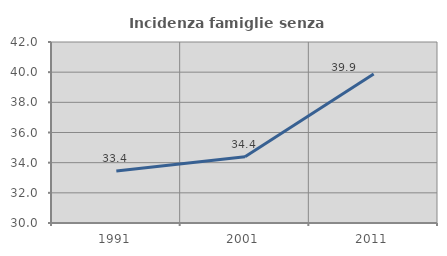
| Category | Incidenza famiglie senza nuclei |
|---|---|
| 1991.0 | 33.446 |
| 2001.0 | 34.386 |
| 2011.0 | 39.874 |